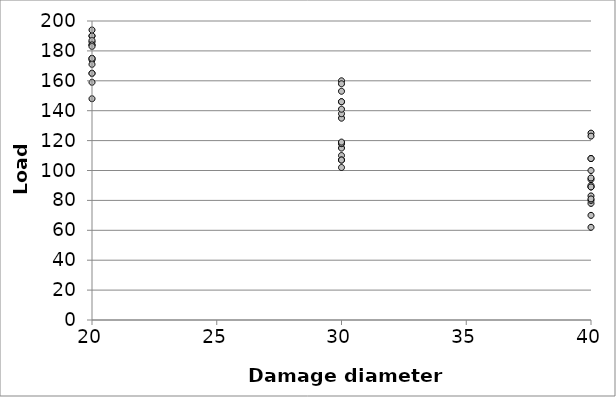
| Category | Failure load |
|---|---|
| 20.0 | 165 |
| 20.0 | 175 |
| 20.0 | 190 |
| 20.0 | 190 |
| 20.0 | 165 |
| 20.0 | 174 |
| 20.0 | 186 |
| 20.0 | 187 |
| 20.0 | 159 |
| 20.0 | 171 |
| 20.0 | 184 |
| 20.0 | 184 |
| 20.0 | 148 |
| 20.0 | 175 |
| 20.0 | 183 |
| 20.0 | 194 |
| 30.0 | 102 |
| 30.0 | 115 |
| 30.0 | 135 |
| 30.0 | 146 |
| 30.0 | 110 |
| 30.0 | 118 |
| 30.0 | 146 |
| 30.0 | 160 |
| 30.0 | 107 |
| 30.0 | 118 |
| 30.0 | 138 |
| 30.0 | 158 |
| 30.0 | 107 |
| 30.0 | 119 |
| 30.0 | 141 |
| 30.0 | 153 |
| 40.0 | 70 |
| 40.0 | 78 |
| 40.0 | 89 |
| 40.0 | 100 |
| 40.0 | 62 |
| 40.0 | 83 |
| 40.0 | 94 |
| 40.0 | 95 |
| 40.0 | 80 |
| 40.0 | 90 |
| 40.0 | 108 |
| 40.0 | 125 |
| 40.0 | 81 |
| 40.0 | 89 |
| 40.0 | 108 |
| 40.0 | 123 |